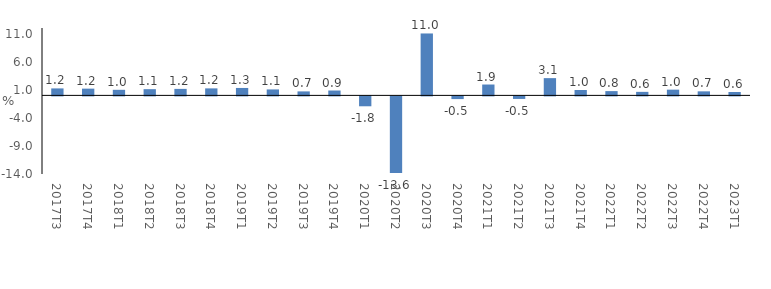
| Category | Series 0 |
|---|---|
| 2017Τ3 | 1.242 |
| 2017Τ4 | 1.201 |
| 2018Τ1 | 0.993 |
| 2018Τ2 | 1.108 |
| 2018Τ3 | 1.156 |
| 2018Τ4 | 1.247 |
| 2019Τ1 | 1.322 |
| 2019Τ2 | 1.061 |
| 2019Τ3 | 0.71 |
| 2019Τ4 | 0.867 |
| 2020Τ1 | -1.763 |
| 2020Τ2 | -13.645 |
| 2020Τ3 | 11.027 |
| 2020Τ4 | -0.481 |
| 2021Τ1 | 1.936 |
| 2021Τ2 | -0.455 |
| 2021Τ3 | 3.072 |
| 2021Τ4 | 0.959 |
| 2022Τ1 | 0.762 |
| 2022Τ2 | 0.628 |
| 2022Τ3 | 1.021 |
| 2022Τ4 | 0.719 |
| 2023Τ1 | 0.607 |